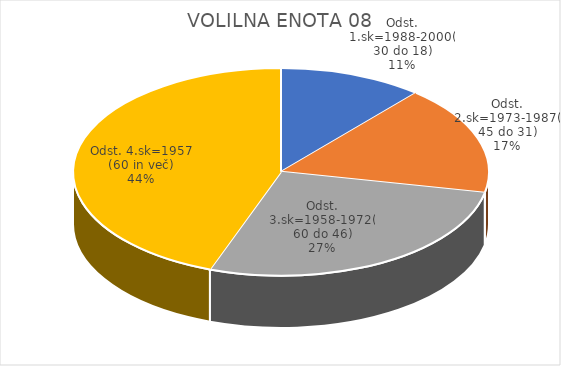
| Category | VOLILNA ENOTA 08 |
|---|---|
| Odst. 1.sk=1988-2000(30 do 18) | 1.49 |
| Odst. 2.sk=1973-1987(45 do 31) | 2.25 |
| Odst. 3.sk=1958-1972(60 do 46) | 3.62 |
| Odst. 4.sk=1957 (60 in več) | 5.89 |